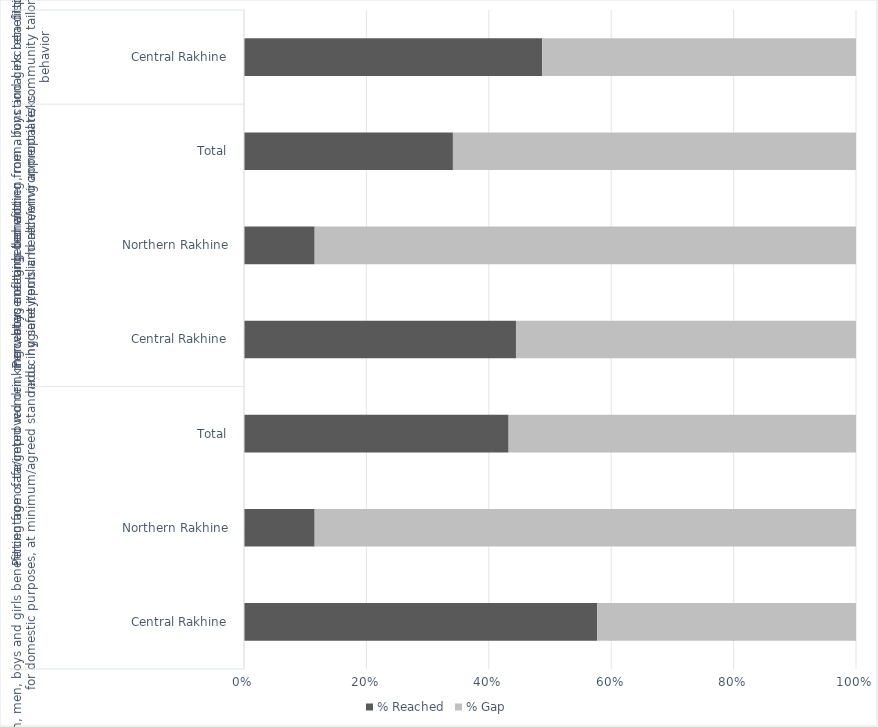
| Category | % Reached | % Gap |
|---|---|---|
| 0 | 0.577 | 0.423 |
| 1 | 0.115 | 0.885 |
| 2 | 0.432 | 0.568 |
| 3 | 0.444 | 0.556 |
| 4 | 0.115 | 0.885 |
| 5 | 0.341 | 0.659 |
| 6 | 0.487 | 0.513 |